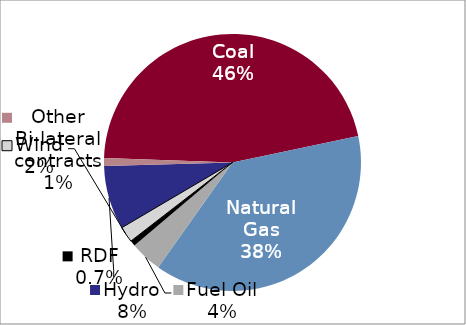
| Category | 2012-13 Capacity |
|---|---|
| Coal | 0.46 |
| Natural Gas | 0.38 |
| Fuel Oil | 0.04 |
| RDF | 0.007 |
| Wind | 0.02 |
| Hydro | 0.08 |
| Other Bi-lateral contracts | 0.01 |